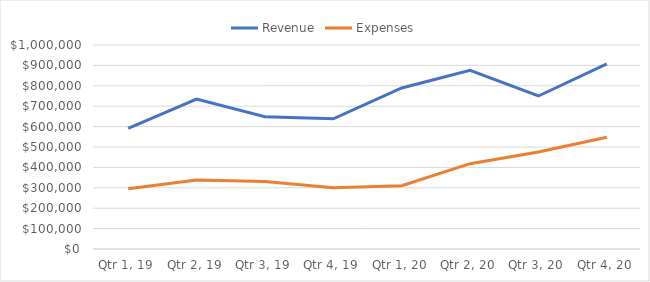
| Category | Revenue | Expenses |
|---|---|---|
| Qtr 1, 19 | 591163 | 295581.5 |
| Qtr 2, 19 | 734599 | 337915.54 |
| Qtr 3, 19 | 648414 | 330691.14 |
| Qtr 4, 19 | 638115 | 299914.05 |
| Qtr 1, 20 | 789542 | 310222 |
| Qtr 2, 20 | 875963 | 418375 |
| Qtr 3, 20 | 750078 | 475896 |
| Qtr 4, 20 | 907800 | 548001 |